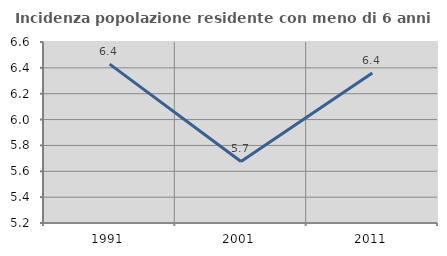
| Category | Incidenza popolazione residente con meno di 6 anni |
|---|---|
| 1991.0 | 6.429 |
| 2001.0 | 5.676 |
| 2011.0 | 6.36 |